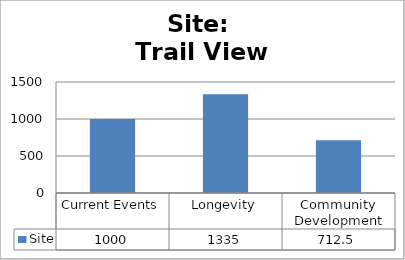
| Category | Site |
|---|---|
| Current Events | 1000 |
| Longevity | 1335 |
| Community Development | 712.5 |